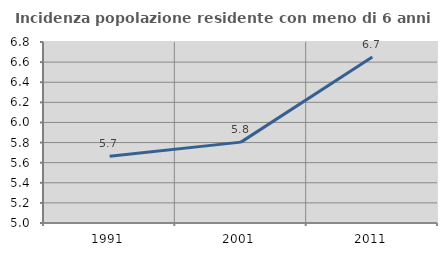
| Category | Incidenza popolazione residente con meno di 6 anni |
|---|---|
| 1991.0 | 5.665 |
| 2001.0 | 5.804 |
| 2011.0 | 6.651 |